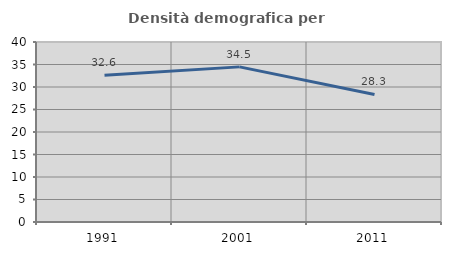
| Category | Densità demografica |
|---|---|
| 1991.0 | 32.595 |
| 2001.0 | 34.472 |
| 2011.0 | 28.348 |